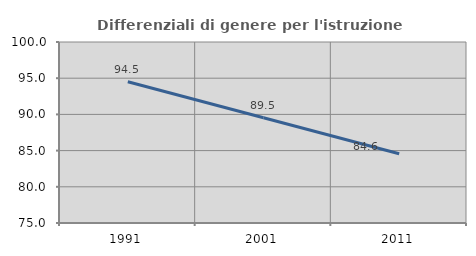
| Category | Differenziali di genere per l'istruzione superiore |
|---|---|
| 1991.0 | 94.502 |
| 2001.0 | 89.542 |
| 2011.0 | 84.562 |